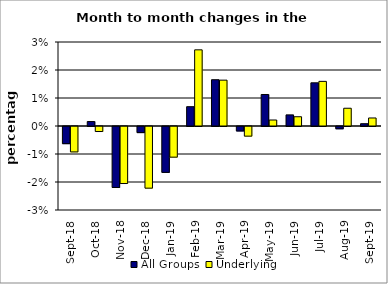
| Category | All Groups | Underlying |
|---|---|---|
| 2018-09-01 | -0.006 | -0.009 |
| 2018-10-01 | 0.002 | -0.002 |
| 2018-11-01 | -0.022 | -0.02 |
| 2018-12-01 | -0.002 | -0.022 |
| 2019-01-01 | -0.016 | -0.011 |
| 2019-02-01 | 0.007 | 0.027 |
| 2019-03-01 | 0.017 | 0.016 |
| 2019-04-01 | -0.002 | -0.003 |
| 2019-05-01 | 0.011 | 0.002 |
| 2019-06-01 | 0.004 | 0.003 |
| 2019-07-01 | 0.015 | 0.016 |
| 2019-08-01 | -0.001 | 0.006 |
| 2019-09-01 | 0.001 | 0.003 |